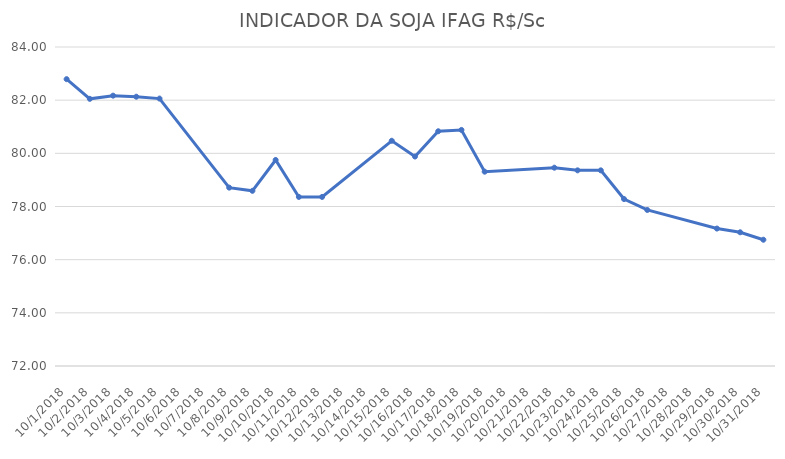
| Category | INDICADOR DA SOJA IFAG |
|---|---|
| 10/1/18 | 82.79 |
| 10/2/18 | 82.05 |
| 10/3/18 | 82.17 |
| 10/4/18 | 82.13 |
| 10/5/18 | 82.06 |
| 10/8/18 | 78.71 |
| 10/9/18 | 78.59 |
| 10/10/18 | 79.75 |
| 10/11/18 | 78.36 |
| 10/12/18 | 78.36 |
| 10/15/18 | 80.473 |
| 10/16/18 | 79.88 |
| 10/17/18 | 80.83 |
| 10/18/18 | 80.88 |
| 10/19/18 | 79.31 |
| 10/22/18 | 79.46 |
| 10/23/18 | 79.36 |
| 10/24/18 | 79.36 |
| 10/25/18 | 78.28 |
| 10/26/18 | 77.87 |
| 10/29/18 | 77.17 |
| 10/30/18 | 77.03 |
| 10/31/18 | 76.75 |